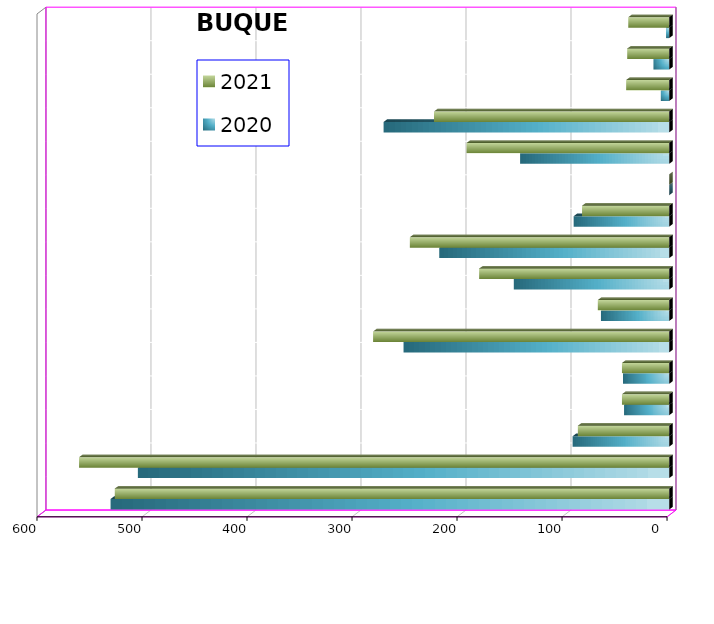
| Category | 2020 | 2021 |
|---|---|---|
| ICAVE | 532 | 528 |
| CICE | 506 | 562 |
| T. C. E. | 92 | 87 |
| CARGILL | 43 | 45 |
| TMV | 44 | 45 |
| SSA | 253 | 282 |
| SEPSA | 65 | 68 |
| VOPAK | 148 | 181 |
| CPV | 219 | 247 |
| EXCELLENCE | 91 | 83 |
| APASCO | 0 | 0 |
| SIPPB | 142 | 193 |
| PEMEX | 272 | 224 |
| PETRA | 8 | 41 |
| OPEVER | 15 | 40 |
| ESJ ERNOVABLE III | 3 | 39 |